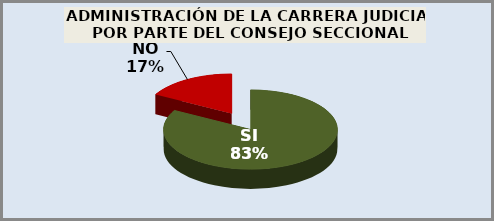
| Category | Series 0 |
|---|---|
| SI | 0.83 |
| NO | 0.17 |